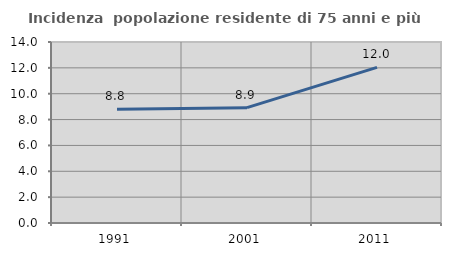
| Category | Incidenza  popolazione residente di 75 anni e più |
|---|---|
| 1991.0 | 8.79 |
| 2001.0 | 8.92 |
| 2011.0 | 12.034 |